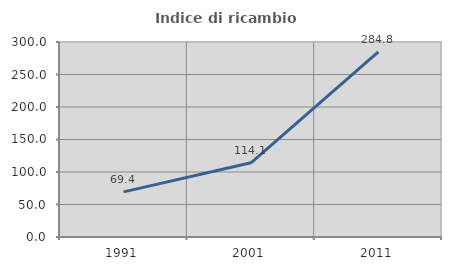
| Category | Indice di ricambio occupazionale  |
|---|---|
| 1991.0 | 69.403 |
| 2001.0 | 114.141 |
| 2011.0 | 284.848 |